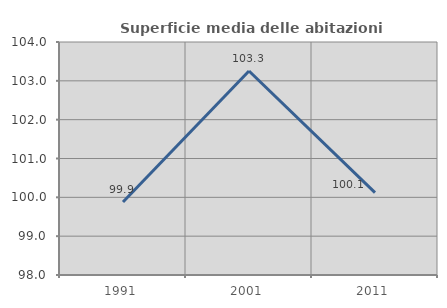
| Category | Superficie media delle abitazioni occupate |
|---|---|
| 1991.0 | 99.879 |
| 2001.0 | 103.253 |
| 2011.0 | 100.122 |